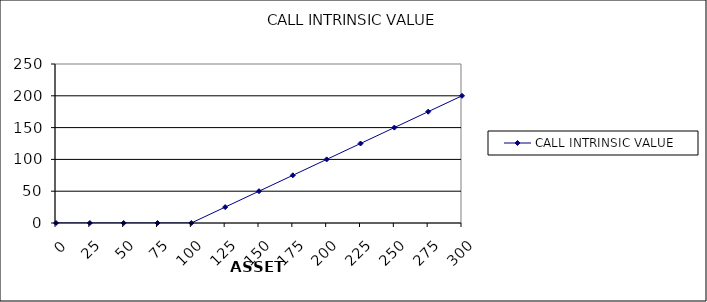
| Category | CALL INTRINSIC VALUE |
|---|---|
| 0.0 | 0 |
| 25.0 | 0 |
| 50.0 | 0 |
| 75.0 | 0 |
| 100.0 | 0 |
| 125.0 | 25 |
| 150.0 | 50 |
| 175.0 | 75 |
| 200.0 | 100 |
| 225.0 | 125 |
| 250.0 | 150 |
| 275.0 | 175 |
| 300.0 | 200 |